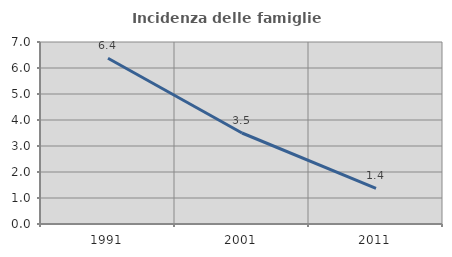
| Category | Incidenza delle famiglie numerose |
|---|---|
| 1991.0 | 6.376 |
| 2001.0 | 3.5 |
| 2011.0 | 1.368 |